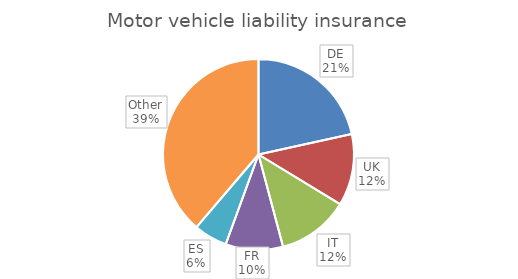
| Category | Motor vehicle liability insurance |
|---|---|
| DE | 144899.62 |
| UK | 81743.52 |
| IT | 81651.19 |
| FR | 65303.81 |
| ES | 38112.4 |
| Other | 260619.72 |